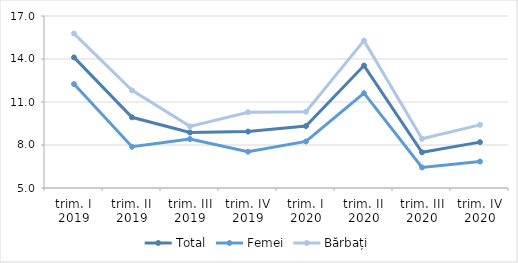
| Category | Total | Femei | Bărbați |
|---|---|---|---|
| trim. I
2019 | 14.113 | 12.25 | 15.775 |
| trim. II
2019 | 9.932 | 7.876 | 11.811 |
| trim. III
2019 | 8.87 | 8.414 | 9.302 |
| trim. IV
2019 | 8.936 | 7.532 | 10.285 |
| trim. I
2020 | 9.322 | 8.246 | 10.32 |
| trim. II
2020 | 13.542 | 11.617 | 15.282 |
| trim. III
2020 | 7.489 | 6.436 | 8.432 |
| trim. IV
2020 | 8.2 | 6.845 | 9.407 |